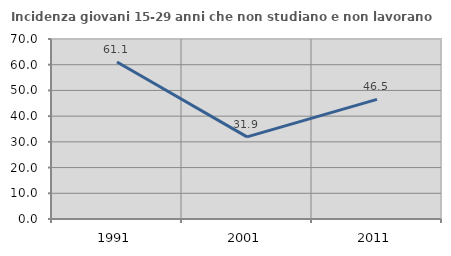
| Category | Incidenza giovani 15-29 anni che non studiano e non lavorano  |
|---|---|
| 1991.0 | 61.078 |
| 2001.0 | 31.944 |
| 2011.0 | 46.5 |